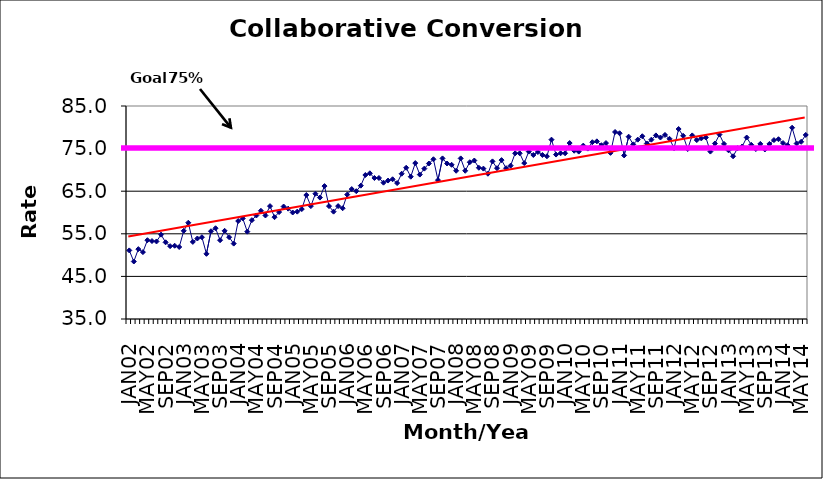
| Category | Series 0 |
|---|---|
| JAN02 | 51.1 |
| FEB02 | 48.5 |
| MAR02 | 51.4 |
| APR02 | 50.7 |
| MAY02 | 53.5 |
| JUN02 | 53.3 |
| JUL02 | 53.2 |
| AUG02 | 54.8 |
| SEP02 | 53 |
| OCT02 | 52.1 |
| NOV02 | 52.2 |
| DEC02 | 51.9 |
| JAN03 | 55.7 |
| FEB03 | 57.6 |
| MAR03 | 53.1 |
| APR03 | 53.9 |
| MAY03 | 54.2 |
| JUN03 | 50.3 |
| JUL03 | 55.6 |
| AUG03 | 56.3 |
| SEP03 | 53.5 |
| OCT03 | 55.7 |
| NOV03 | 54.2 |
| DEC03 | 52.7 |
| JAN04 | 58 |
| FEB04 | 58.6 |
| MAR04 | 55.5 |
| APR04 | 58.2 |
| MAY04 | 59.3 |
| JUN04 | 60.4 |
| JUL04 | 59.3 |
| AUG04 | 61.5 |
| SEP04 | 58.9 |
| OCT04 | 60.1 |
| NOV04 | 61.4 |
| DEC04 | 60.9 |
| JAN05 | 60 |
| FEB05 | 60.2 |
| MAR05 | 60.8 |
| APR05 | 64.1 |
| MAY05 | 61.5 |
| JUN05 | 64.4 |
| JUL05 | 63.5 |
| AUG05 | 66.2 |
| SEP05 | 61.5 |
| OCT05 | 60.2 |
| NOV05 | 61.5 |
| DEC05 | 61 |
| JAN06 | 64.2 |
| FEB06 | 65.5 |
| MAR06 | 65 |
| APR06 | 66.3 |
| MAY06 | 68.8 |
| JUN06 | 69.2 |
| JUL06 | 68.1 |
| AUG06 | 68.1 |
| SEP06 | 67 |
| OCT06 | 67.5 |
| NOV06 | 67.8 |
| DEC06 | 66.9 |
| JAN07 | 69.1 |
| FEB07 | 70.5 |
| MAR07 | 68.4 |
| APR07 | 71.6 |
| MAY07 | 68.9 |
| JUN07 | 70.3 |
| JUL07 | 71.5 |
| AUG07 | 72.5 |
| SEP07 | 67.6 |
| OCT07 | 72.7 |
| NOV07 | 71.5 |
| DEC07 | 71.2 |
| JAN08 | 69.8 |
| FEB08 | 72.7 |
| MAR08 | 69.8 |
| APR08 | 71.8 |
| MAY08 | 72.2 |
| JUN08 | 70.5 |
| JUL08 | 70.3 |
| AUG08 | 69.1 |
| SEP08 | 72 |
| OCT08 | 70.4 |
| NOV08 | 72.3 |
| DEC08 | 70.4 |
| JAN09 | 71 |
| FEB09 | 73.9 |
| MAR09 | 73.9 |
| APR09 | 71.6 |
| MAY09 | 74.3 |
| JUN09 | 73.5 |
| JUL09 | 74.2 |
| AUG09 | 73.5 |
| SEP09 | 73.2 |
| OCT09 | 77.1 |
| NOV09 | 73.6 |
| DEC09 | 73.9 |
| JAN10 | 73.9 |
| FEB10 | 76.3 |
| MAR10 | 74.5 |
| APR10 | 74.3 |
| MAY10 | 75.7 |
| JUN10 | 75 |
| JUL10 | 76.5 |
| AUG10 | 76.7 |
| SEP10 | 75.8 |
| OCT10 | 76.3 |
| NOV10 | 74 |
| DEC10 | 78.9 |
| JAN11 | 78.6 |
| FEB11 | 73.4 |
| MAR11 | 77.8 |
| APR11 | 76 |
| MAY11 | 77.1 |
| JUN11 | 77.9 |
| JUL11 | 76.2 |
| AUG11 | 77.1 |
| SEP11 | 78.1 |
| OCT11 | 77.6 |
| NOV11 | 78.2 |
| DEC11 | 77.3 |
| JAN12 | 75.1 |
| FEB12 | 79.6 |
| MAR12 | 78 |
| APR12 | 74.9 |
| MAY12 | 78.1 |
| JUN12 | 77 |
| JUL12 | 77.4 |
| AUG12 | 77.6 |
| SEP12 | 74.3 |
| OCT12 | 76.2 |
| NOV12 | 78.3 |
| DEC12 | 76.1 |
| JAN13 | 74.6 |
| FEB13 | 73.2 |
| MAR13 | 75.1 |
| APR13 | 75.5 |
| MAY13 | 77.6 |
| JUN13 | 75.9 |
| JUL13 | 74.9 |
| AUG13 | 76.1 |
| SEP13 | 74.8 |
| OCT13 | 76.1 |
| NOV13 | 77 |
| DEC13 | 77.2 |
| JAN14 | 76.3 |
| FEB14 | 75.8 |
| MAR14 | 79.9 |
| APR14 | 76.2 |
| MAY14 | 76.6 |
| JUN14 | 78.2 |